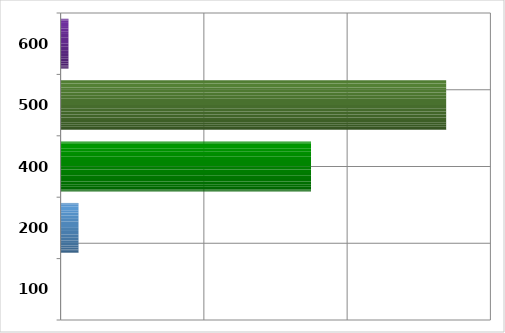
| Category | Series 0 |
|---|---|
| 100.0 | 0 |
| 200.0 | 2500000 |
| 400.0 | 34956722.344 |
| 500.0 | 53825679.9 |
| 600.0 | 1100000 |